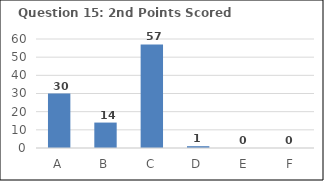
| Category | Series 0 |
|---|---|
| A | 30 |
| B | 14 |
| C | 57 |
| D | 1 |
| E | 0 |
| F | 0 |